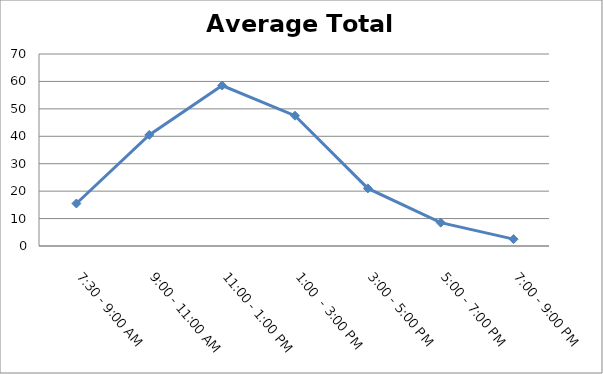
| Category | Total |
|---|---|
| 7:30 - 9:00 AM | 15.5 |
| 9:00 - 11:00 AM | 40.5 |
| 11:00 - 1:00 PM | 58.5 |
| 1:00  - 3:00 PM | 47.5 |
| 3:00 - 5:00 PM | 21 |
| 5:00 - 7:00 PM | 8.5 |
| 7:00 - 9:00 PM | 2.5 |